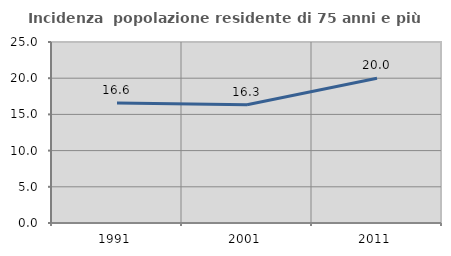
| Category | Incidenza  popolazione residente di 75 anni e più |
|---|---|
| 1991.0 | 16.567 |
| 2001.0 | 16.332 |
| 2011.0 | 19.986 |